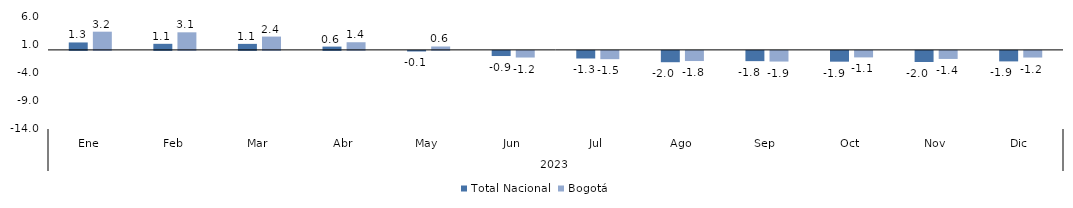
| Category | Total Nacional | Bogotá |
|---|---|---|
| 0 | 1.319 | 3.225 |
| 1 | 1.077 | 3.113 |
| 2 | 1.067 | 2.357 |
| 3 | 0.586 | 1.355 |
| 4 | -0.103 | 0.603 |
| 5 | -0.909 | -1.173 |
| 6 | -1.344 | -1.466 |
| 7 | -2.004 | -1.795 |
| 8 | -1.813 | -1.887 |
| 9 | -1.907 | -1.15 |
| 10 | -1.961 | -1.423 |
| 11 | -1.858 | -1.176 |